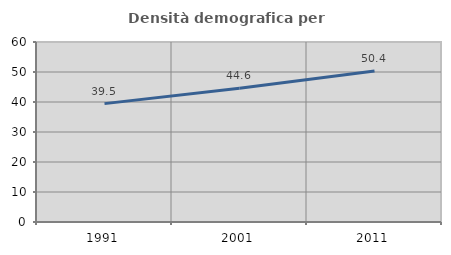
| Category | Densità demografica |
|---|---|
| 1991.0 | 39.461 |
| 2001.0 | 44.575 |
| 2011.0 | 50.366 |